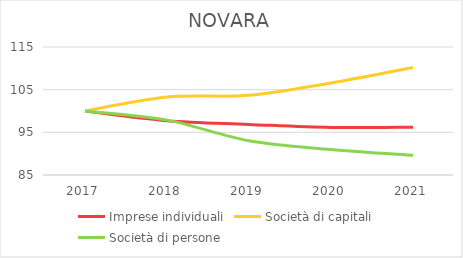
| Category | Imprese individuali | Società di capitali | Società di persone |
|---|---|---|---|
| 2017.0 | 100 | 100 | 100 |
| 2018.0 | 97.717 | 103.277 | 97.865 |
| 2019.0 | 96.861 | 103.664 | 93.025 |
| 2020.0 | 96.138 | 106.583 | 90.985 |
| 2021.0 | 96.213 | 110.217 | 89.609 |